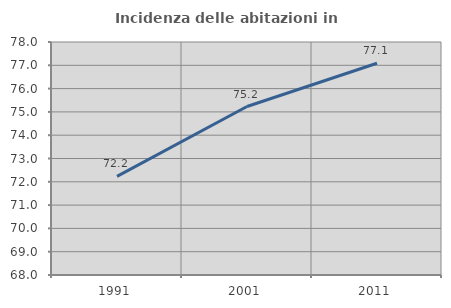
| Category | Incidenza delle abitazioni in proprietà  |
|---|---|
| 1991.0 | 72.235 |
| 2001.0 | 75.231 |
| 2011.0 | 77.089 |